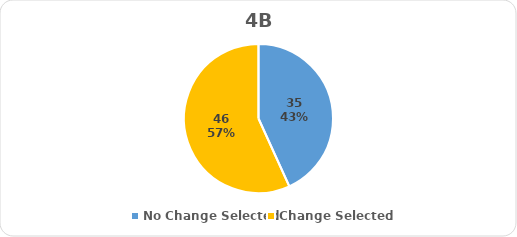
| Category | Series 0 |
|---|---|
| No Change Selected | 35 |
| Change Selected | 46 |